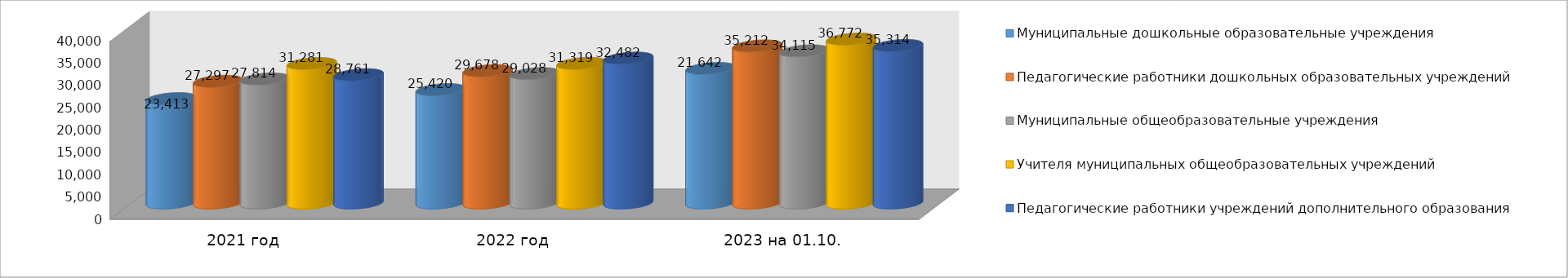
| Category | Муниципальные дошкольные образовательные учреждения | Педагогические работники дошкольных образовательных учреждений | Муниципальные общеобразовательные учреждения | Учителя муниципальных общеобразовательных учреждений | Педагогические работники учреждений дополнительного образования |
|---|---|---|---|---|---|
| 2021 год | 23413 | 27297 | 27814 | 31281 | 28761 |
| 2022 год | 25420 | 29678 | 29028 | 31319 | 32482 |
| 2023 на 01.10. | 30180 | 35212 | 34115 | 36772 | 35314 |